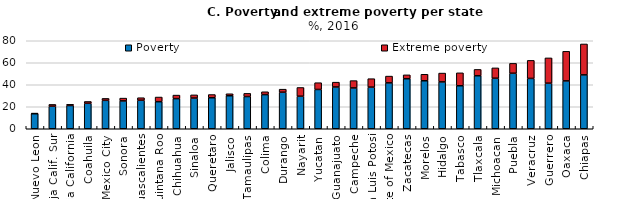
| Category | Poverty | Extreme poverty |
|---|---|---|
| Nuevo Leon | 13.638 | 0.608 |
| Baja Calif. Sur | 20.518 | 1.608 |
| Baja California | 21.115 | 1.118 |
| Coahuila | 23.162 | 1.653 |
| Mexico City | 25.837 | 1.758 |
| Sonora | 25.339 | 2.524 |
| Aguascalientes | 25.915 | 2.304 |
| Quintana Roo | 24.61 | 4.237 |
| Chihuahua | 27.391 | 3.217 |
| Sinaloa | 27.921 | 2.886 |
| Queretaro | 28.196 | 2.923 |
| Jalisco | 30.014 | 1.8 |
| Tamaulipas | 29.28 | 2.882 |
| Colima | 31.024 | 2.608 |
| Durango | 33.216 | 2.773 |
| Nayarit | 29.595 | 7.93 |
| Yucatan | 35.724 | 6.148 |
| Guanajuato | 37.977 | 4.382 |
| Campeche | 37.11 | 6.657 |
| San Luis Potosi | 37.843 | 7.677 |
| State of Mexico | 41.727 | 6.148 |
| Zacatecas | 45.48 | 3.524 |
| Morelos | 43.626 | 5.919 |
| Hidalgo | 42.602 | 8.019 |
| Tabasco | 39.083 | 11.769 |
| Tlaxcala | 48.201 | 5.744 |
| Michoacan | 45.949 | 9.389 |
| Puebla | 50.482 | 8.958 |
| Veracruz | 45.757 | 16.403 |
| Guerrero | 41.446 | 22.962 |
| Oaxaca | 43.521 | 26.88 |
| Chiapas | 49.002 | 28.079 |